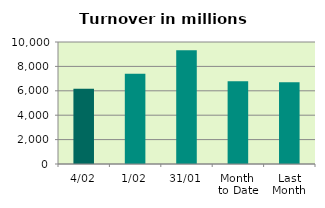
| Category | Series 0 |
|---|---|
| 4/02 | 6170.165 |
| 1/02 | 7390.077 |
| 31/01 | 9321.23 |
| Month 
to Date | 6780.121 |
| Last
Month | 6707.699 |